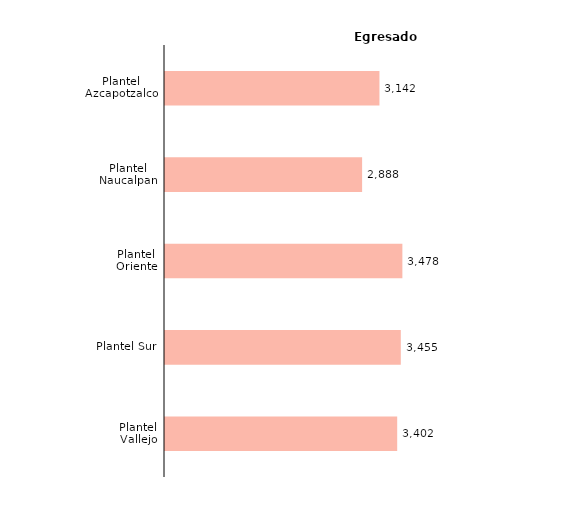
| Category | Series 0 |
|---|---|
| Plantel Vallejo | 3402 |
| Plantel Sur | 3455 |
| Plantel Oriente | 3478 |
| Plantel Naucalpan | 2888 |
| Plantel Azcapotzalco | 3142 |